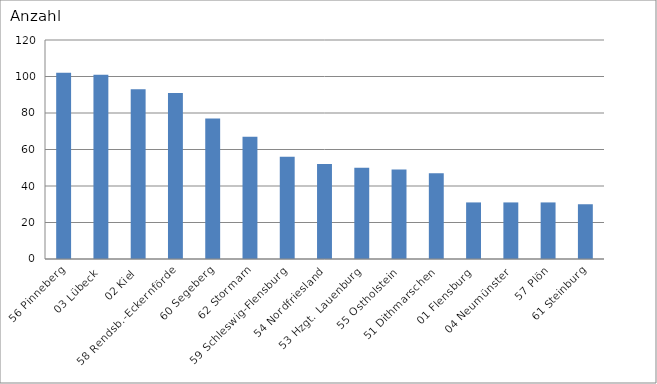
| Category | 56 Pinneberg 03 Lübeck 02 Kiel 58 Rendsb.-Eckernförde 60 Segeberg 62 Stormarn 59 Schleswig-Flensburg 54 Nordfriesland 53 Hzgt. Lauenburg 55 Ostholstein 51 Dithmarschen 01 Flensburg 04 Neumünster 57 Plön 61 Steinburg |
|---|---|
| 56 Pinneberg | 102 |
| 03 Lübeck | 101 |
| 02 Kiel | 93 |
| 58 Rendsb.-Eckernförde | 91 |
| 60 Segeberg | 77 |
| 62 Stormarn | 67 |
| 59 Schleswig-Flensburg | 56 |
| 54 Nordfriesland | 52 |
| 53 Hzgt. Lauenburg | 50 |
| 55 Ostholstein | 49 |
| 51 Dithmarschen | 47 |
| 01 Flensburg | 31 |
| 04 Neumünster | 31 |
| 57 Plön | 31 |
| 61 Steinburg | 30 |